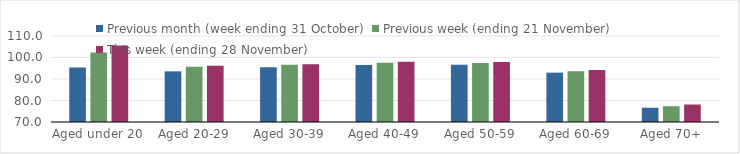
| Category | Previous month (week ending 31 October) | Previous week (ending 21 November) | This week (ending 28 November) |
|---|---|---|---|
| Aged under 20 | 95.34 | 102.32 | 105.57 |
| Aged 20-29 | 93.56 | 95.72 | 96.2 |
| Aged 30-39 | 95.46 | 96.61 | 96.89 |
| Aged 40-49 | 96.53 | 97.58 | 98.03 |
| Aged 50-59 | 96.61 | 97.45 | 97.9 |
| Aged 60-69 | 92.95 | 93.61 | 94.14 |
| Aged 70+ | 76.64 | 77.36 | 78.13 |